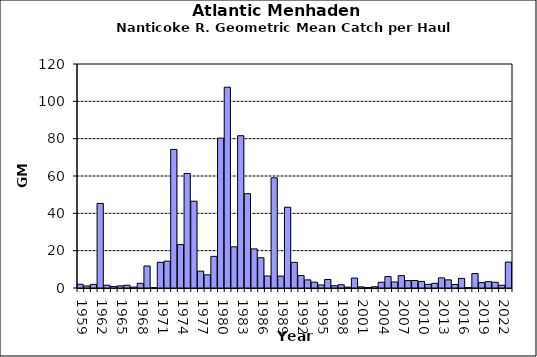
| Category | Series 0 |
|---|---|
| 1959.0 | 2.006 |
| 1960.0 | 1.097 |
| 1961.0 | 1.939 |
| 1962.0 | 45.304 |
| 1963.0 | 1.491 |
| 1964.0 | 0.807 |
| 1965.0 | 1.151 |
| 1966.0 | 1.47 |
| 1967.0 | 0.491 |
| 1968.0 | 2.526 |
| 1969.0 | 11.792 |
| 1970.0 | 0.135 |
| 1971.0 | 13.775 |
| 1972.0 | 14.385 |
| 1973.0 | 74.236 |
| 1974.0 | 23.252 |
| 1975.0 | 61.363 |
| 1976.0 | 46.518 |
| 1977.0 | 9.028 |
| 1978.0 | 7.068 |
| 1979.0 | 16.951 |
| 1980.0 | 80.301 |
| 1981.0 | 107.568 |
| 1982.0 | 22.058 |
| 1983.0 | 81.587 |
| 1984.0 | 50.529 |
| 1985.0 | 20.933 |
| 1986.0 | 16.2 |
| 1987.0 | 6.432 |
| 1988.0 | 59.033 |
| 1989.0 | 6.377 |
| 1990.0 | 43.28 |
| 1991.0 | 13.744 |
| 1992.0 | 6.647 |
| 1993.0 | 4.356 |
| 1994.0 | 3.115 |
| 1995.0 | 1.617 |
| 1996.0 | 4.578 |
| 1997.0 | 1.215 |
| 1998.0 | 1.753 |
| 1999.0 | 0.449 |
| 2000.0 | 5.325 |
| 2001.0 | 0.581 |
| 2002.0 | 0.278 |
| 2003.0 | 0.658 |
| 2004.0 | 3.07 |
| 2005.0 | 6.123 |
| 2006.0 | 3.227 |
| 2007.0 | 6.628 |
| 2008.0 | 3.958 |
| 2009.0 | 4.01 |
| 2010.0 | 3.548 |
| 2011.0 | 1.957 |
| 2012.0 | 2.522 |
| 2013.0 | 5.427 |
| 2014.0 | 4.366 |
| 2015.0 | 1.901 |
| 2016.0 | 5.14 |
| 2017.0 | 0.191 |
| 2018.0 | 7.734 |
| 2019.0 | 2.894 |
| 2020.0 | 3.39 |
| 2021.0 | 3.083 |
| 2022.0 | 1.473 |
| 2021.0 | 13.892 |